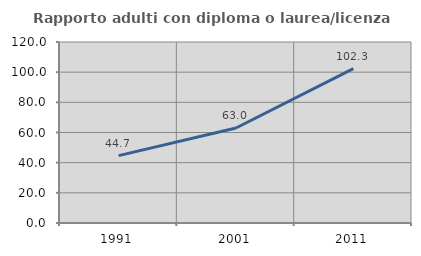
| Category | Rapporto adulti con diploma o laurea/licenza media  |
|---|---|
| 1991.0 | 44.662 |
| 2001.0 | 62.993 |
| 2011.0 | 102.336 |